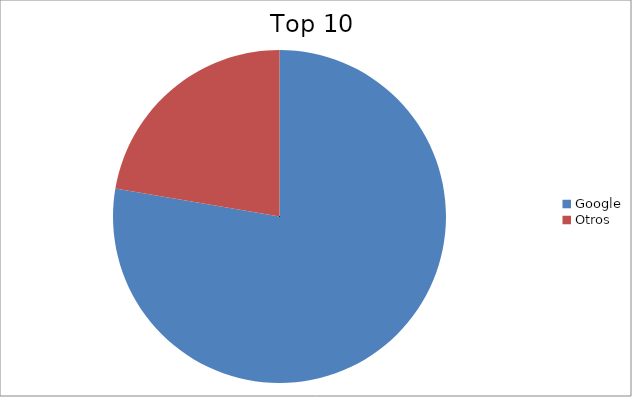
| Category | Series 0 |
|---|---|
| Google | 77.68 |
| Otros | 22.32 |